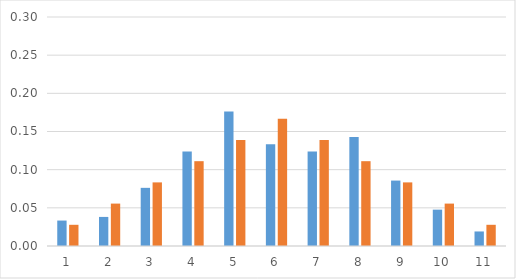
| Category | rel gyak | vsz |
|---|---|---|
| 0 | 0.033 | 0.028 |
| 1 | 0.038 | 0.056 |
| 2 | 0.076 | 0.083 |
| 3 | 0.124 | 0.111 |
| 4 | 0.176 | 0.139 |
| 5 | 0.133 | 0.167 |
| 6 | 0.124 | 0.139 |
| 7 | 0.143 | 0.111 |
| 8 | 0.086 | 0.083 |
| 9 | 0.048 | 0.056 |
| 10 | 0.019 | 0.028 |